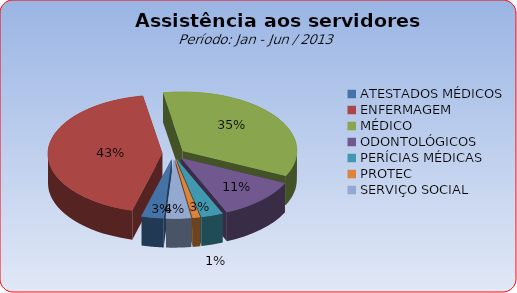
| Category | Series 0 |
|---|---|
| ATESTADOS MÉDICOS | 3.112 |
| ENFERMAGEM | 43.037 |
| MÉDICO | 34.746 |
| ODONTOLÓGICOS | 11.484 |
| PERÍCIAS MÉDICAS | 3.059 |
| PROTEC | 1.046 |
| SERVIÇO SOCIAL | 3.515 |